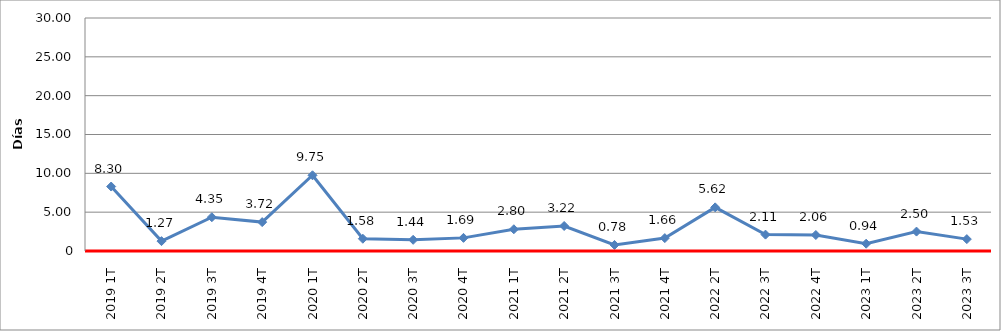
| Category | Total |
|---|---|
| 2019 1T | 8.3 |
| 2019 2T | 1.27 |
| 2019 3T | 4.35 |
| 2019 4T | 3.72 |
| 2020 1T | 9.75 |
| 2020 2T | 1.58 |
| 2020 3T | 1.44 |
| 2020 4T | 1.69 |
| 2021 1T | 2.8 |
| 2021 2T | 3.22 |
| 2021 3T | 0.78 |
| 2021 4T | 1.66 |
| 2022 2T | 5.62 |
| 2022 3T | 2.11 |
| 2022 4T | 2.06 |
| 2023 1T | 0.94 |
| 2023 2T | 2.5 |
| 2023 3T | 1.53 |